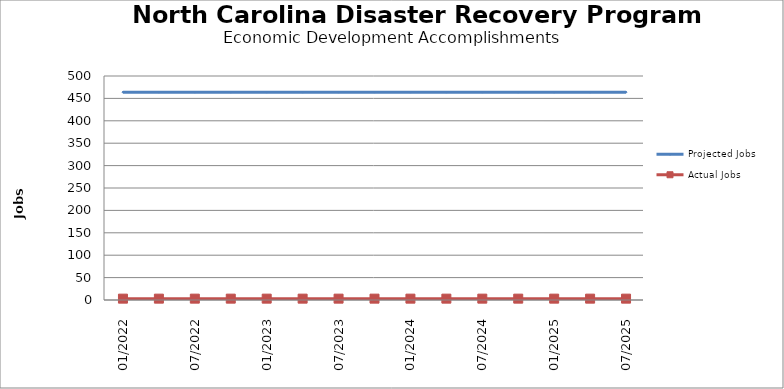
| Category | Projected Jobs | Actual Jobs |
|---|---|---|
| 01/2022 | 464 | 3 |
| 4/2022 | 464 | 3 |
| 07/2022 | 464 | 3 |
| 10/2022 | 464 | 3 |
| 01/2023 | 464 | 3 |
| 4/2023 | 464 | 3 |
| 07/2023 | 464 | 3 |
| 10/2023 | 464 | 3 |
| 01/2024 | 464 | 3 |
| 4/2024 | 464 | 3 |
| 07/2024 | 464 | 3 |
| 10/2024 | 464 | 3 |
| 01/2025 | 464 | 3 |
| 4/2025 | 464 | 3 |
| 07/2025 | 464 | 3 |